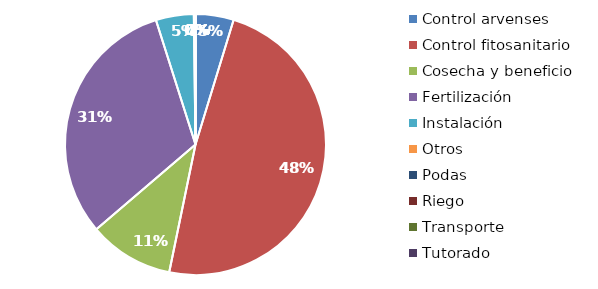
| Category | Valor |
|---|---|
| Control arvenses | 1222938 |
| Control fitosanitario | 12556502 |
| Cosecha y beneficio | 2719758.898 |
| Fertilización | 8118992 |
| Instalación | 1215359.187 |
| Otros | 52914 |
| Podas | 0 |
| Riego | 0 |
| Transporte | 0 |
| Tutorado | 0 |